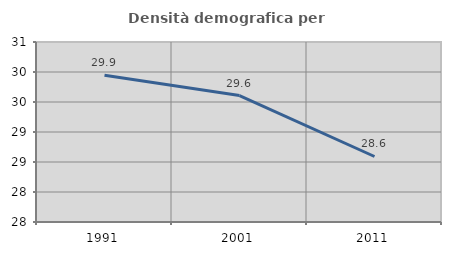
| Category | Densità demografica |
|---|---|
| 1991.0 | 29.946 |
| 2001.0 | 29.607 |
| 2011.0 | 28.592 |